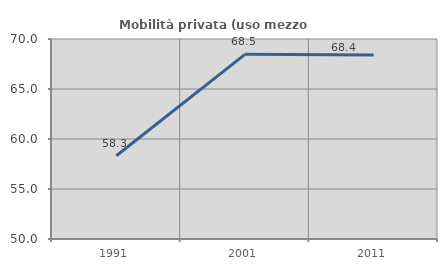
| Category | Mobilità privata (uso mezzo privato) |
|---|---|
| 1991.0 | 58.322 |
| 2001.0 | 68.464 |
| 2011.0 | 68.405 |